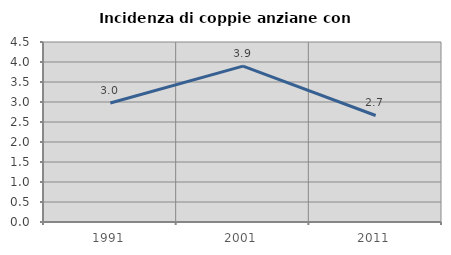
| Category | Incidenza di coppie anziane con figli |
|---|---|
| 1991.0 | 2.975 |
| 2001.0 | 3.896 |
| 2011.0 | 2.663 |